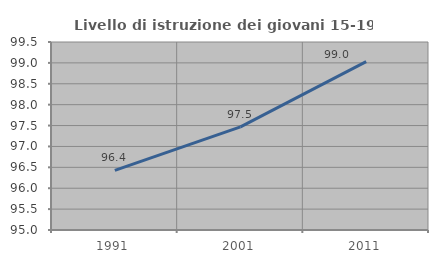
| Category | Livello di istruzione dei giovani 15-19 anni |
|---|---|
| 1991.0 | 96.429 |
| 2001.0 | 97.468 |
| 2011.0 | 99.029 |